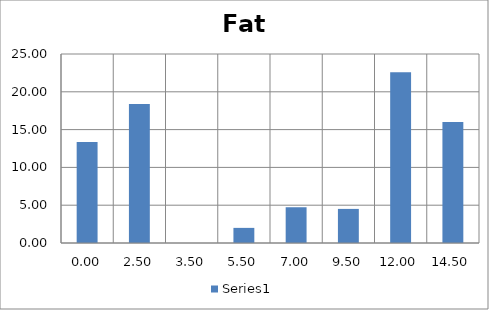
| Category | Series 0 |
|---|---|
| 0.0 | 13.372 |
| 2.5 | 18.385 |
| 3.5 | 0 |
| 5.5 | 2 |
| 7.0 | 4.73 |
| 9.5 | 4.51 |
| 12.0 | 22.6 |
| 14.5 | 16 |